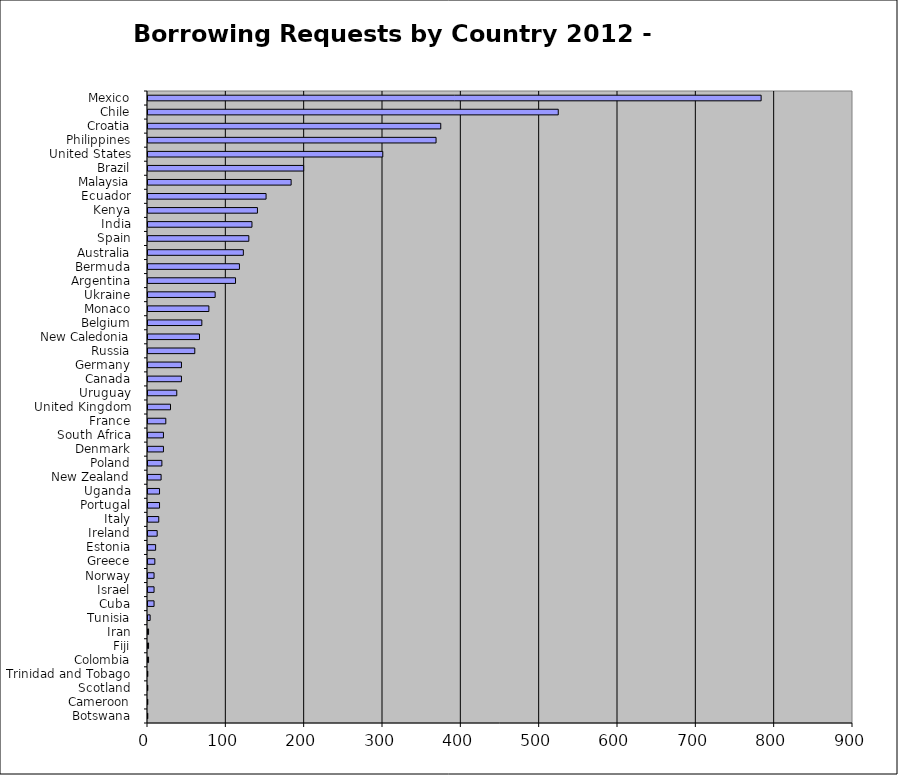
| Category | Series 0 |
|---|---|
| Botswana  | 1 |
| Cameroon  | 1 |
| Scotland  | 1 |
| Trinidad and Tobago  | 1 |
| Colombia  | 2 |
| Fiji  | 2 |
| Iran  | 2 |
| Tunisia  | 4 |
| Cuba  | 9 |
| Israel  | 9 |
| Norway  | 9 |
| Greece  | 10 |
| Estonia  | 11 |
| Ireland  | 13 |
| Italy  | 15 |
| Portugal  | 16 |
| Uganda  | 16 |
| New Zealand  | 18 |
| Poland  | 19 |
| Denmark  | 21 |
| South Africa  | 21 |
| France  | 24 |
| United Kingdom  | 30 |
| Uruguay  | 38 |
| Canada  | 44 |
| Germany  | 44 |
| Russia  | 61 |
| New Caledonia  | 67 |
| Belgium  | 70 |
| Monaco  | 79 |
| Ukraine  | 87 |
| Argentina  | 113 |
| Bermuda  | 118 |
| Australia  | 123 |
| Spain  | 130 |
| India  | 134 |
| Kenya  | 141 |
| Ecuador  | 152 |
| Malaysia  | 184 |
| Brazil  | 200 |
| United States  | 301 |
| Philippines  | 369 |
| Croatia  | 375 |
| Chile  | 525 |
| Mexico  | 784 |